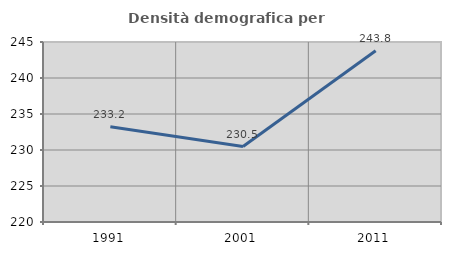
| Category | Densità demografica |
|---|---|
| 1991.0 | 233.215 |
| 2001.0 | 230.477 |
| 2011.0 | 243.78 |